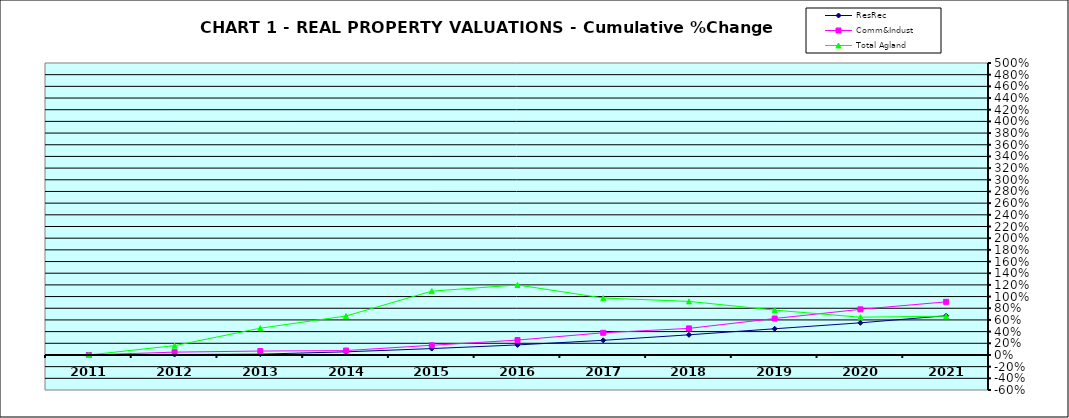
| Category | ResRec | Comm&Indust | Total Agland |
|---|---|---|---|
| 2011.0 | 0 | 0 | 0 |
| 2012.0 | 0.007 | 0.048 | 0.159 |
| 2013.0 | 0.014 | 0.067 | 0.459 |
| 2014.0 | 0.054 | 0.075 | 0.668 |
| 2015.0 | 0.109 | 0.166 | 1.093 |
| 2016.0 | 0.172 | 0.255 | 1.199 |
| 2017.0 | 0.251 | 0.38 | 0.975 |
| 2018.0 | 0.345 | 0.455 | 0.918 |
| 2019.0 | 0.449 | 0.624 | 0.768 |
| 2020.0 | 0.551 | 0.781 | 0.646 |
| 2021.0 | 0.671 | 0.909 | 0.665 |